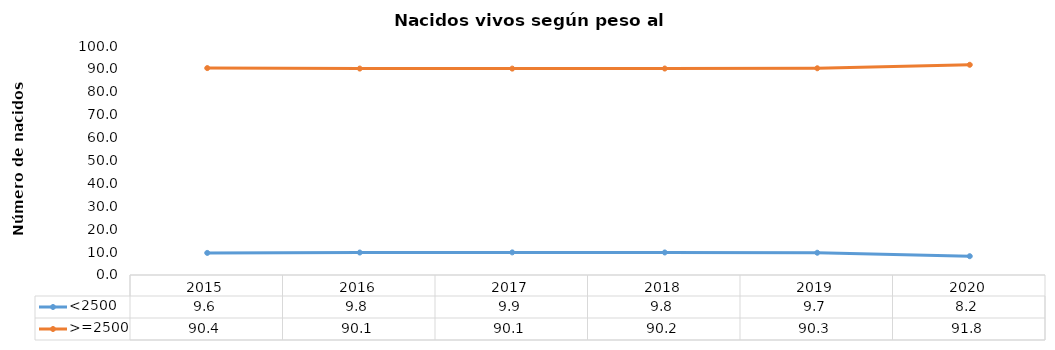
| Category | <2500 | >=2500 |
|---|---|---|
| 2015.0 | 9.647 | 90.353 |
| 2016.0 | 9.815 | 90.147 |
| 2017.0 | 9.873 | 90.127 |
| 2018.0 | 9.84 | 90.16 |
| 2019.0 | 9.722 | 90.278 |
| 2020.0 | 8.209 | 91.791 |